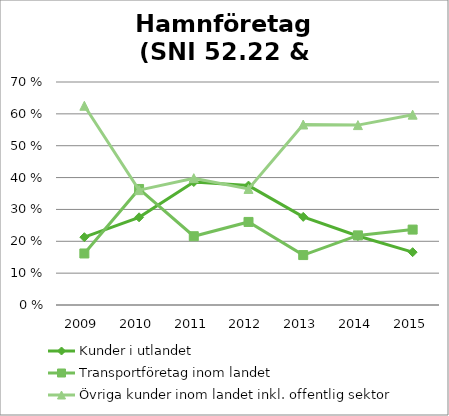
| Category | Kunder i utlandet | Transportföretag inom landet | Övriga kunder inom landet inkl. offentlig sektor |
|---|---|---|---|
| 2009.0 | 0.213 | 0.162 | 0.625 |
| 2010.0 | 0.275 | 0.364 | 0.361 |
| 2011.0 | 0.386 | 0.216 | 0.398 |
| 2012.0 | 0.375 | 0.261 | 0.364 |
| 2013.0 | 0.277 | 0.157 | 0.567 |
| 2014.0 | 0.217 | 0.219 | 0.565 |
| 2015.0 | 0.166 | 0.237 | 0.597 |